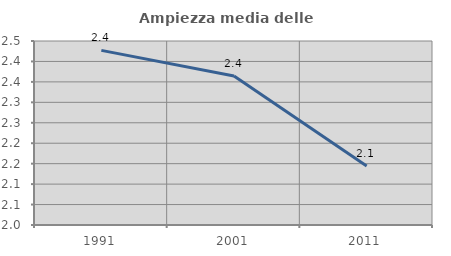
| Category | Ampiezza media delle famiglie |
|---|---|
| 1991.0 | 2.427 |
| 2001.0 | 2.364 |
| 2011.0 | 2.144 |